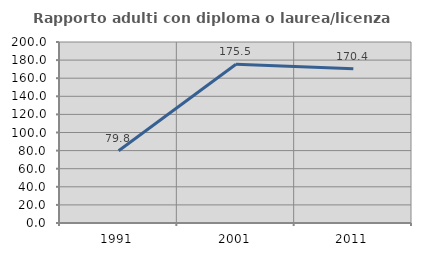
| Category | Rapporto adulti con diploma o laurea/licenza media  |
|---|---|
| 1991.0 | 79.817 |
| 2001.0 | 175.467 |
| 2011.0 | 170.364 |